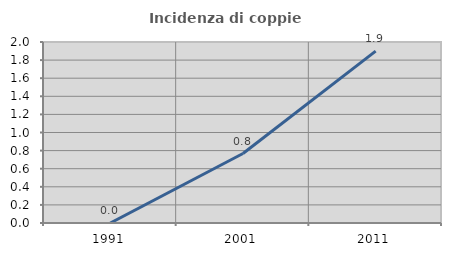
| Category | Incidenza di coppie miste |
|---|---|
| 1991.0 | 0 |
| 2001.0 | 0.768 |
| 2011.0 | 1.899 |